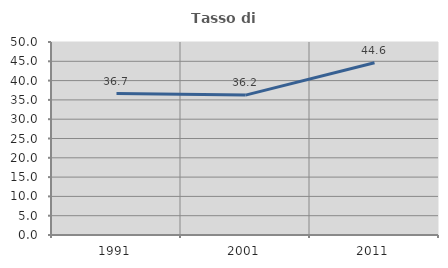
| Category | Tasso di occupazione   |
|---|---|
| 1991.0 | 36.65 |
| 2001.0 | 36.247 |
| 2011.0 | 44.624 |